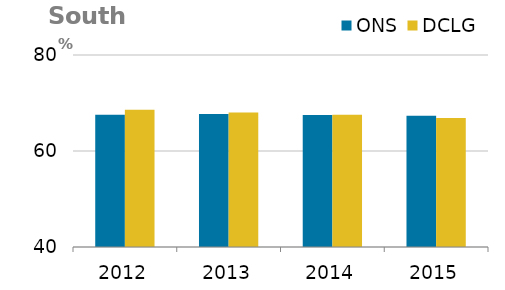
| Category | ONS | DCLG |
|---|---|---|
| 0 | 67.55 | 68.598 |
| 1 | 67.71 | 68.025 |
| 2 | 67.49 | 67.534 |
| 3 | 67.34 | 66.854 |